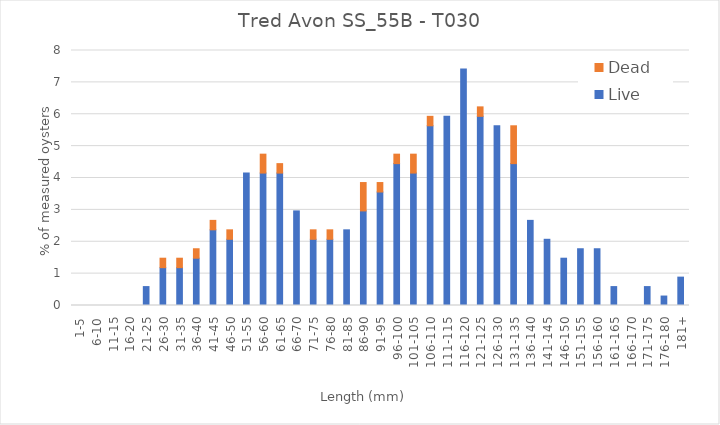
| Category | Live | Dead |
|---|---|---|
| 1-5 | 0 | 0 |
| 6-10 | 0 | 0 |
| 11-15 | 0 | 0 |
| 16-20 | 0 | 0 |
| 21-25 | 0.593 | 0 |
| 26-30 | 1.187 | 0.297 |
| 31-35 | 1.187 | 0.297 |
| 36-40 | 1.484 | 0.297 |
| 41-45 | 2.374 | 0.297 |
| 46-50 | 2.077 | 0.297 |
| 51-55 | 4.154 | 0 |
| 56-60 | 4.154 | 0.593 |
| 61-65 | 4.154 | 0.297 |
| 66-70 | 2.967 | 0 |
| 71-75 | 2.077 | 0.297 |
| 76-80 | 2.077 | 0.297 |
| 81-85 | 2.374 | 0 |
| 86-90 | 2.967 | 0.89 |
| 91-95 | 3.561 | 0.297 |
| 96-100 | 4.451 | 0.297 |
| 101-105 | 4.154 | 0.593 |
| 106-110 | 5.638 | 0.297 |
| 111-115 | 5.935 | 0 |
| 116-120 | 7.418 | 0 |
| 121-125 | 5.935 | 0.297 |
| 126-130 | 5.638 | 0 |
| 131-135 | 4.451 | 1.187 |
| 136-140 | 2.671 | 0 |
| 141-145 | 2.077 | 0 |
| 146-150 | 1.484 | 0 |
| 151-155 | 1.78 | 0 |
| 156-160 | 1.78 | 0 |
| 161-165 | 0.593 | 0 |
| 166-170 | 0 | 0 |
| 171-175 | 0.593 | 0 |
| 176-180 | 0.297 | 0 |
| 181+ | 0.89 | 0 |